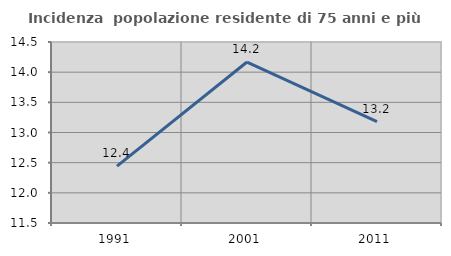
| Category | Incidenza  popolazione residente di 75 anni e più |
|---|---|
| 1991.0 | 12.444 |
| 2001.0 | 14.168 |
| 2011.0 | 13.18 |